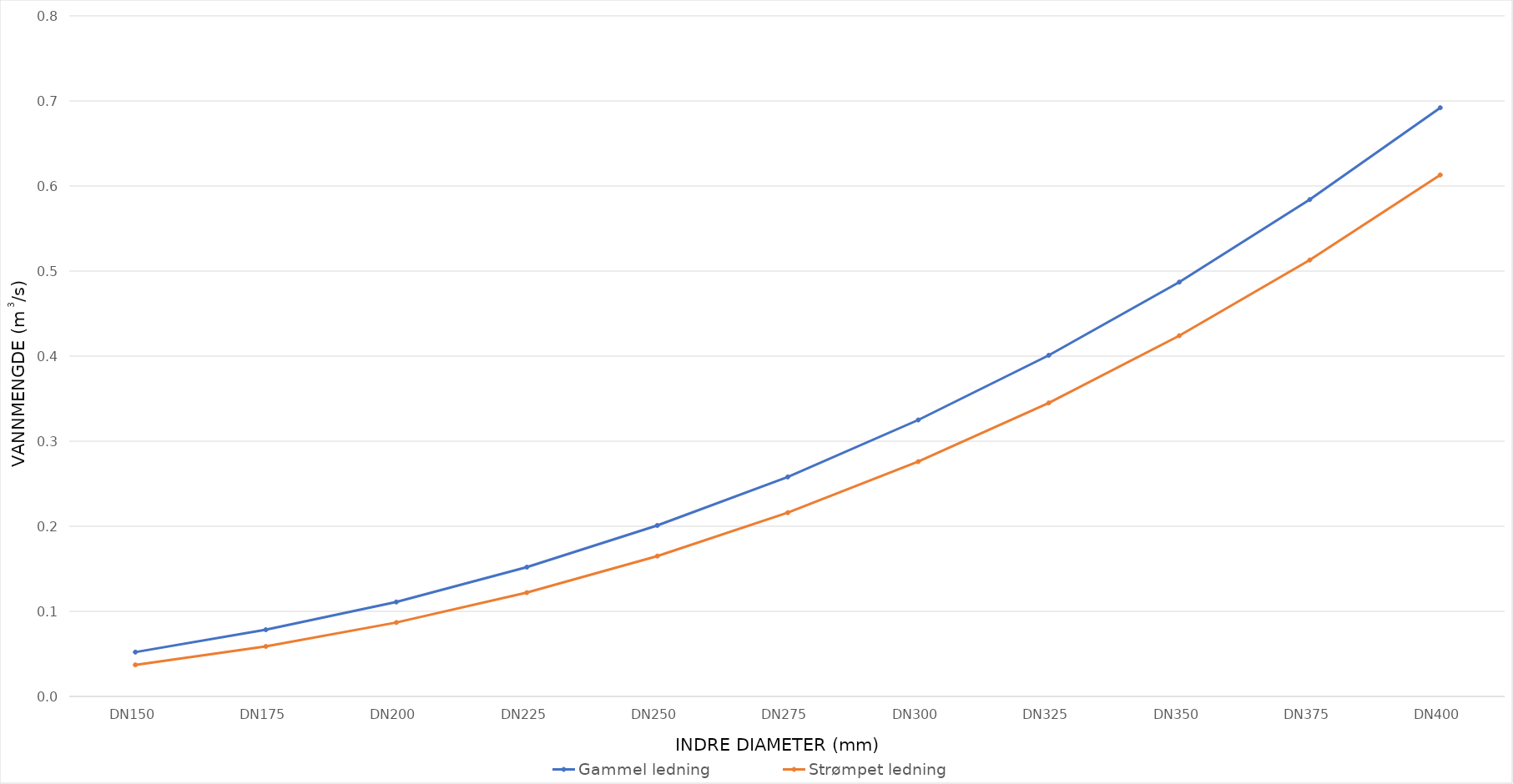
| Category | Gammel ledning | Strømpet ledning |
|---|---|---|
| DN150 | 0.052 | 0.037 |
| DN175 | 0.078 | 0.059 |
| DN200 | 0.111 | 0.087 |
| DN225 | 0.152 | 0.122 |
| DN250 | 0.201 | 0.165 |
| DN275 | 0.258 | 0.216 |
| DN300 | 0.325 | 0.276 |
| DN325 | 0.401 | 0.345 |
| DN350 | 0.487 | 0.424 |
| DN375 | 0.584 | 0.513 |
| DN400 | 0.692 | 0.613 |